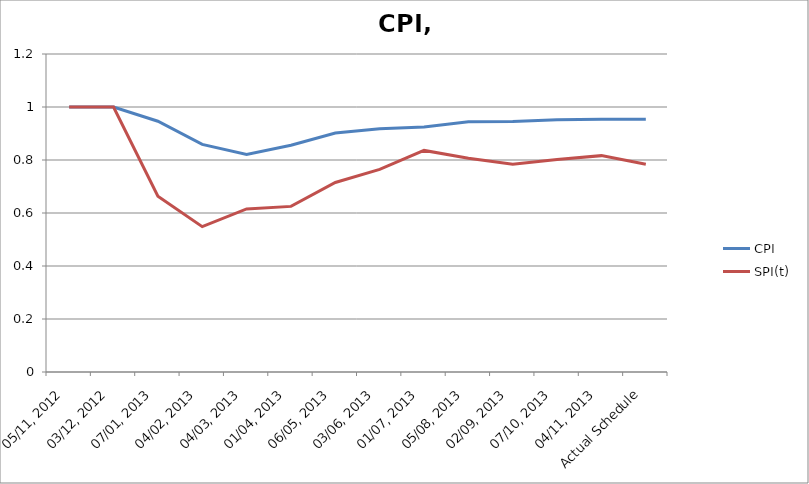
| Category | CPI | SPI(t) |
|---|---|---|
| 05/11, 2012 | 1 | 1 |
| 03/12, 2012 | 1 | 1 |
| 07/01, 2013 | 0.946 | 0.663 |
| 04/02, 2013 | 0.859 | 0.549 |
| 04/03, 2013 | 0.821 | 0.615 |
| 01/04, 2013 | 0.856 | 0.625 |
| 06/05, 2013 | 0.902 | 0.715 |
| 03/06, 2013 | 0.918 | 0.764 |
| 01/07, 2013 | 0.924 | 0.836 |
| 05/08, 2013 | 0.945 | 0.807 |
| 02/09, 2013 | 0.946 | 0.784 |
| 07/10, 2013 | 0.952 | 0.802 |
| 04/11, 2013 | 0.954 | 0.816 |
| Actual Schedule | 0.954 | 0.784 |